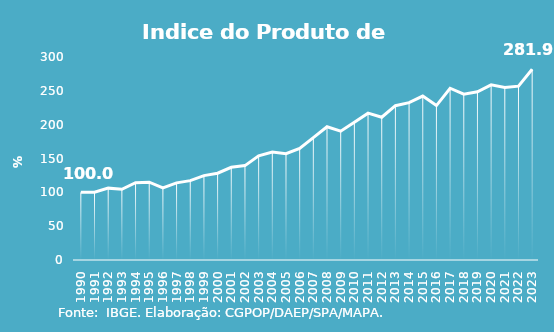
| Category | Indice de Prod. base 1990 |
|---|---|
| 1990.0 | 100 |
| 1991.0 | 100.275 |
| 1992.0 | 106.203 |
| 1993.0 | 104.57 |
| 1994.0 | 114.164 |
| 1995.0 | 115.024 |
| 1996.0 | 106.552 |
| 1997.0 | 114.037 |
| 1998.0 | 117.319 |
| 1999.0 | 124.734 |
| 2000.0 | 128.293 |
| 2001.0 | 136.975 |
| 2002.0 | 139.51 |
| 2003.0 | 153.868 |
| 2004.0 | 159.641 |
| 2005.0 | 157.136 |
| 2006.0 | 164.858 |
| 2007.0 | 180.781 |
| 2008.0 | 196.91 |
| 2009.0 | 190.309 |
| 2010.0 | 203.581 |
| 2011.0 | 217.041 |
| 2012.0 | 210.932 |
| 2013.0 | 228.009 |
| 2014.0 | 232.562 |
| 2015.0 | 242.318 |
| 2016.0 | 228.239 |
| 2017.0 | 253.826 |
| 2018.0 | 245.134 |
| 2019.0 | 248.619 |
| 2020.0 | 258.848 |
| 2021.0 | 254.988 |
| 2022.0 | 256.903 |
| 2023.0 | 281.926 |